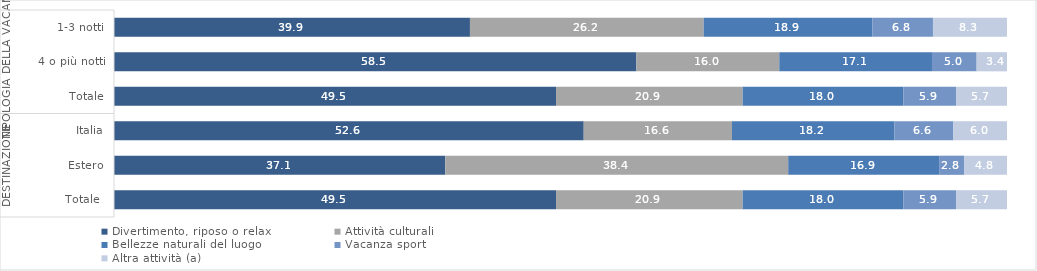
| Category | Divertimento, riposo o relax                 | Attività culturali | Bellezze naturali del luogo          | Vacanza sport                                 | Altra attività (a)            |
|---|---|---|---|---|---|
| 0 | 39.9 | 26.2 | 18.9 | 6.8 | 8.3 |
| 1 | 58.5 | 16 | 17.1 | 5 | 3.4 |
| 2 | 49.5 | 20.9 | 18 | 5.9 | 5.7 |
| 3 | 52.6 | 16.6 | 18.2 | 6.6 | 6 |
| 4 | 37.1 | 38.4 | 16.9 | 2.8 | 4.8 |
| 5 | 49.5 | 20.9 | 18 | 5.9 | 5.7 |